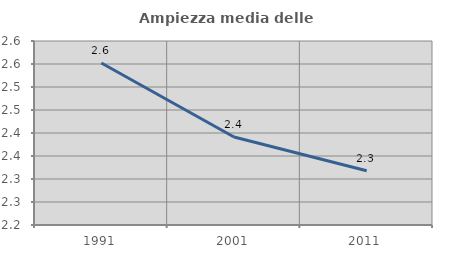
| Category | Ampiezza media delle famiglie |
|---|---|
| 1991.0 | 2.552 |
| 2001.0 | 2.391 |
| 2011.0 | 2.318 |